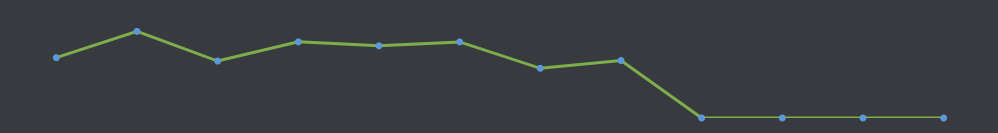
| Category | Available Cash |
|---|---|
| JAN | 820 |
| FEB | 1177 |
| MAR | 774 |
| APR | 1035 |
| MAY | 981 |
| JUN | 1034 |
| JUL | 675 |
| AUG | 781 |
| SEP | 0 |
| OCT | 0 |
| NOV | 0 |
| DEC | 0 |